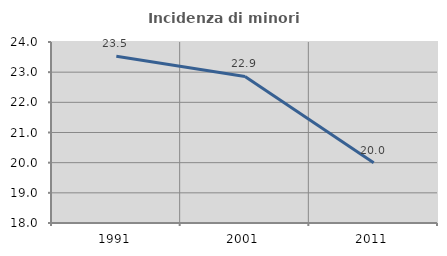
| Category | Incidenza di minori stranieri |
|---|---|
| 1991.0 | 23.529 |
| 2001.0 | 22.857 |
| 2011.0 | 20 |